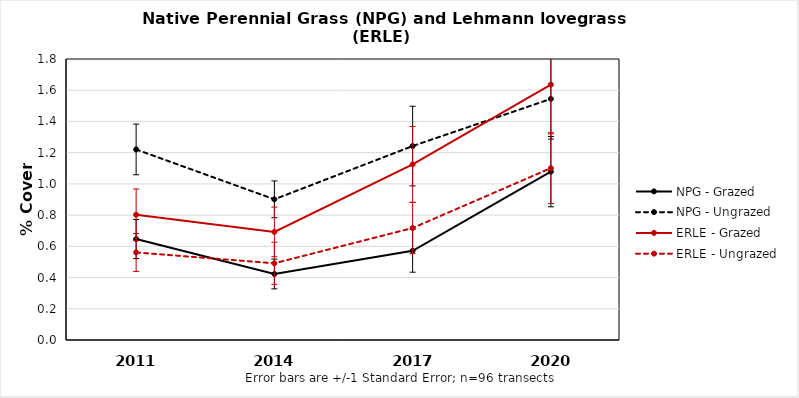
| Category | NPG - Grazed | NPG - Ungrazed | ERLE - Grazed | ERLE - Ungrazed |
|---|---|---|---|---|
| 2011.0 | 0.647 | 1.221 | 0.802 | 0.561 |
| 2014.0 | 0.423 | 0.901 | 0.692 | 0.491 |
| 2017.0 | 0.572 | 1.242 | 1.125 | 0.717 |
| 2020.0 | 1.078 | 1.545 | 1.636 | 1.101 |